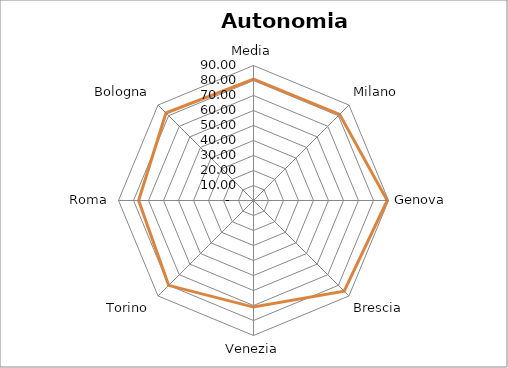
| Category | Autonomia finanziaria |
|---|---|
| Media | 80.857 |
| Milano | 81.22 |
| Genova | 89.16 |
| Brescia | 85.46 |
| Venezia | 71.06 |
| Torino | 80.01 |
| Roma | 76.58 |
| Bologna | 82.51 |